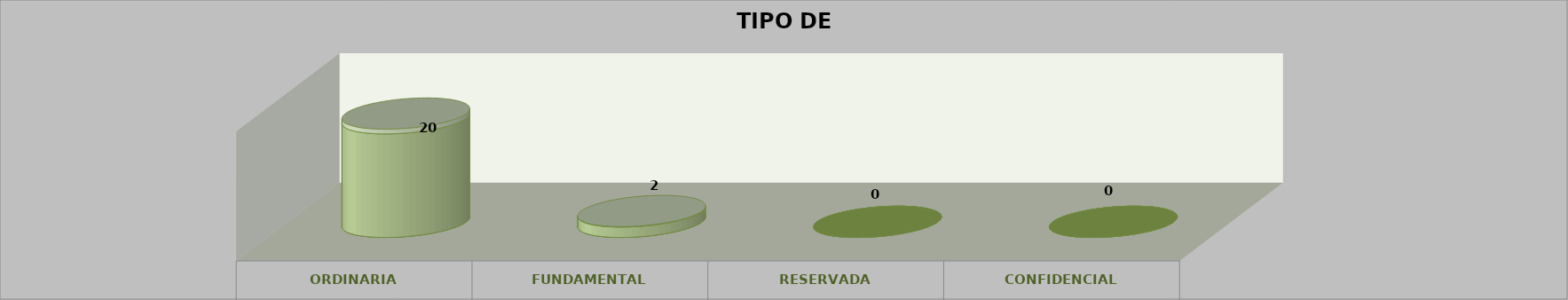
| Category | Series 0 | Series 2 | Series 1 | Series 3 | Series 4 |
|---|---|---|---|---|---|
| 0 |  |  |  | 20 | 0.909 |
| 1 |  |  |  | 2 | 0.091 |
| 2 |  |  |  | 0 | 0 |
| 3 |  |  |  | 0 | 0 |